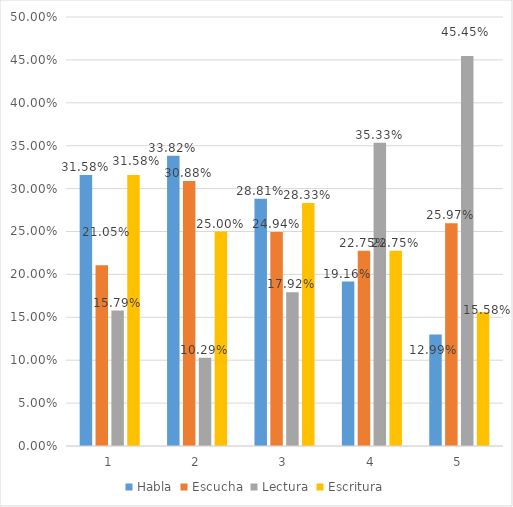
| Category | Habla | Escucha | Lectura | Escritura |
|---|---|---|---|---|
| 0 | 0.316 | 0.211 | 0.158 | 0.316 |
| 1 | 0.338 | 0.309 | 0.103 | 0.25 |
| 2 | 0.288 | 0.249 | 0.179 | 0.283 |
| 3 | 0.192 | 0.228 | 0.353 | 0.228 |
| 4 | 0.13 | 0.26 | 0.455 | 0.156 |